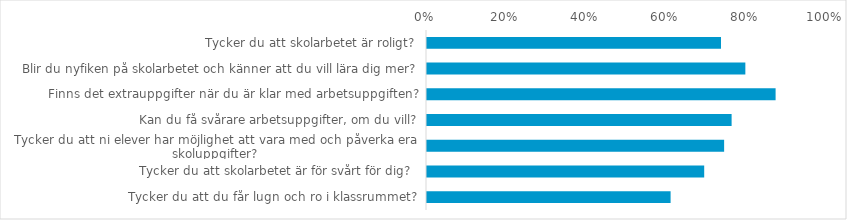
| Category | (Alla) |
|---|---|
| Tycker du att skolarbetet är roligt? | 0.737 |
| Blir du nyfiken på skolarbetet och känner att du vill lära dig mer? | 0.798 |
| Finns det extrauppgifter när du är klar med arbetsuppgiften? | 0.874 |
| Kan du få svårare arbetsuppgifter, om du vill? | 0.763 |
| Tycker du att ni elever har möjlighet att vara med och påverka era skoluppgifter? | 0.745 |
| Tycker du att skolarbetet är för svårt för dig?  | 0.695 |
| Tycker du att du får lugn och ro i klassrummet? | 0.611 |